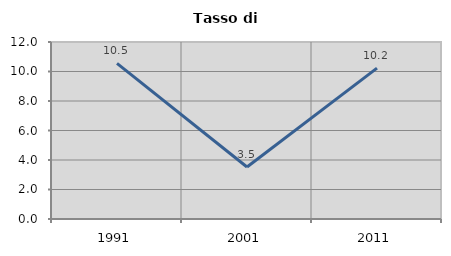
| Category | Tasso di disoccupazione   |
|---|---|
| 1991.0 | 10.547 |
| 2001.0 | 3.525 |
| 2011.0 | 10.227 |